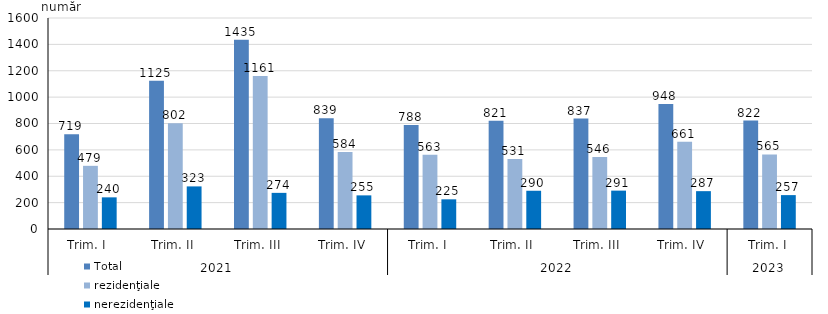
| Category | Total | rezidenţiale | nerezidenţiale |
|---|---|---|---|
| 0 | 719 | 479 | 240 |
| 1 | 1125 | 802 | 323 |
| 2 | 1435 | 1161 | 274 |
| 3 | 839 | 584 | 255 |
| 4 | 788 | 563 | 225 |
| 5 | 821 | 531 | 290 |
| 6 | 837 | 546 | 291 |
| 7 | 948 | 661 | 287 |
| 8 | 822 | 565 | 257 |